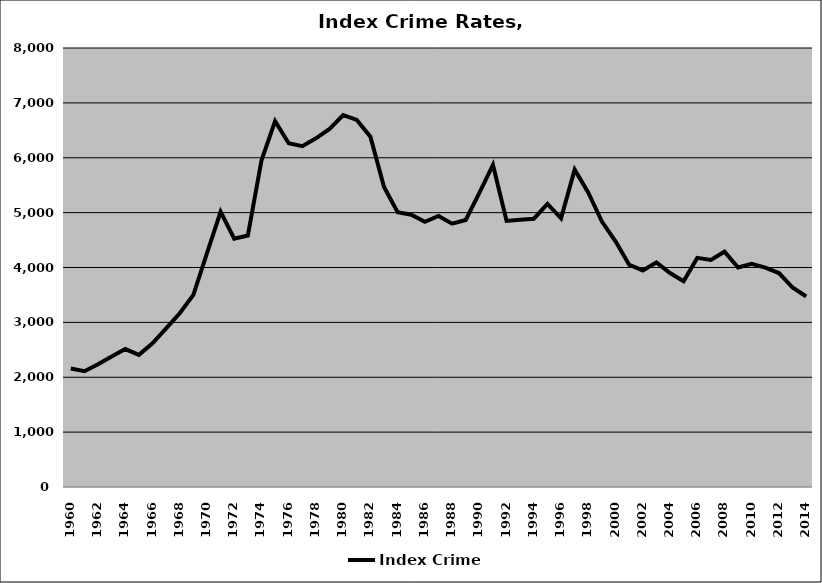
| Category | Index Crime |
|---|---|
| 1960.0 | 2160.469 |
| 1961.0 | 2109.389 |
| 1962.0 | 2237.74 |
| 1963.0 | 2377.311 |
| 1964.0 | 2513.646 |
| 1965.0 | 2408.713 |
| 1966.0 | 2619.727 |
| 1967.0 | 2891.603 |
| 1968.0 | 3165.543 |
| 1969.0 | 3501.667 |
| 1970.0 | 4263.06 |
| 1971.0 | 5015.054 |
| 1972.0 | 4523.717 |
| 1973.0 | 4582.639 |
| 1974.0 | 5949.564 |
| 1975.0 | 6668.221 |
| 1976.0 | 6264.433 |
| 1977.0 | 6210.137 |
| 1978.0 | 6353.859 |
| 1979.0 | 6525.773 |
| 1980.0 | 6776.635 |
| 1981.0 | 6689.298 |
| 1982.0 | 6384.884 |
| 1983.0 | 5466.007 |
| 1984.0 | 5006.852 |
| 1985.0 | 4961.254 |
| 1986.0 | 4831.596 |
| 1987.0 | 4938.82 |
| 1988.0 | 4799.091 |
| 1989.0 | 4865.23 |
| 1990.0 | 5360.36 |
| 1991.0 | 5869.412 |
| 1992.0 | 4848.476 |
| 1993.0 | 4872.143 |
| 1994.0 | 4889.518 |
| 1995.0 | 5158.717 |
| 1996.0 | 4894.897 |
| 1997.0 | 5782.923 |
| 1998.0 | 5363.172 |
| 1999.0 | 4837.978 |
| 2000.0 | 4478.05 |
| 2001.0 | 4050.595 |
| 2002.0 | 3946.051 |
| 2003.0 | 4090.612 |
| 2004.0 | 3898.592 |
| 2005.0 | 3751.391 |
| 2006.0 | 4175.513 |
| 2007.0 | 4138.586 |
| 2008.0 | 4288.008 |
| 2009.0 | 3999.223 |
| 2010.0 | 4069.119 |
| 2011.0 | 3997.965 |
| 2012.0 | 3898.902 |
| 2013.0 | 3635.165 |
| 2014.0 | 3471.09 |